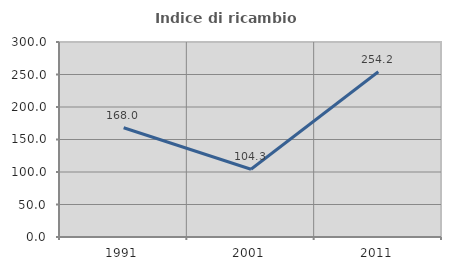
| Category | Indice di ricambio occupazionale  |
|---|---|
| 1991.0 | 168 |
| 2001.0 | 104.274 |
| 2011.0 | 254.237 |